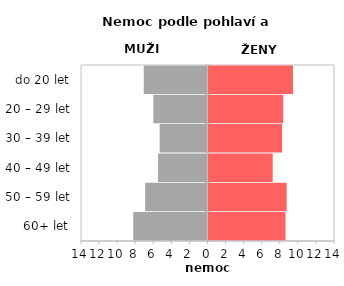
| Category | Nemoc |
|---|---|
| 60+ let | 8.528 |
| 50 – 59 let | 8.651 |
| 40 – 49 let | 7.108 |
| 30 – 39 let | 8.143 |
| 20 – 29 let | 8.272 |
| do 20 let | 9.35 |